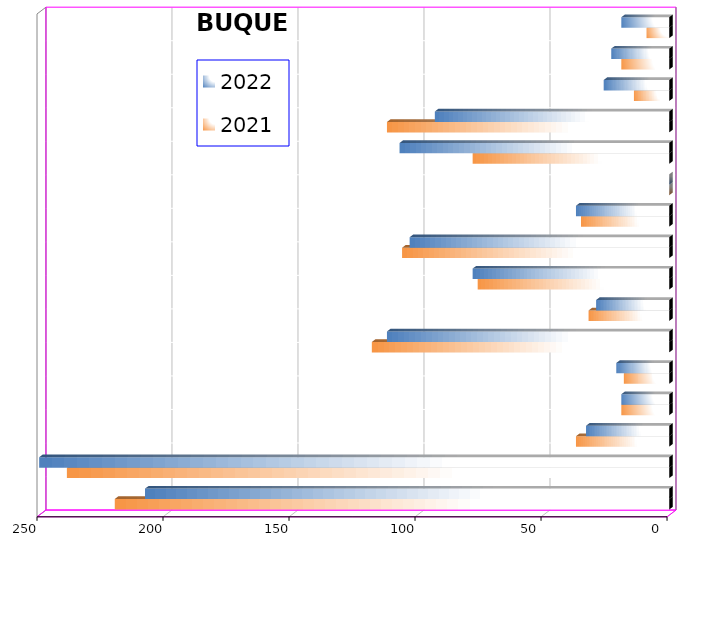
| Category | 2021 | 2022 |
|---|---|---|
| ICAVE | 220 | 208 |
| CICE | 239 | 250 |
| T. C. E. | 37 | 33 |
| CARGILL | 19 | 19 |
| TMV | 18 | 21 |
| SSA | 118 | 112 |
| SEPSA | 32 | 29 |
| VOPAK | 76 | 78 |
| CPV | 106 | 103 |
| EXCELLENCE | 35 | 37 |
| APASCO | 0 | 0 |
| SIPPB | 78 | 107 |
| PEMEX | 112 | 93 |
| PETRA | 14 | 26 |
| OPEVER | 19 | 23 |
| ESJ Renovable III | 9 | 19 |